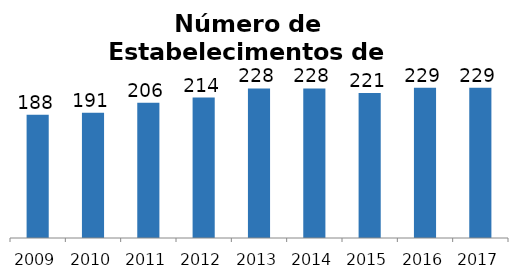
| Category | Agências de Viagem |
|---|---|
| 2009.0 | 188 |
| 2010.0 | 191 |
| 2011.0 | 206 |
| 2012.0 | 214 |
| 2013.0 | 228 |
| 2014.0 | 228 |
| 2015.0 | 221 |
| 2016.0 | 229 |
| 2017.0 | 229 |